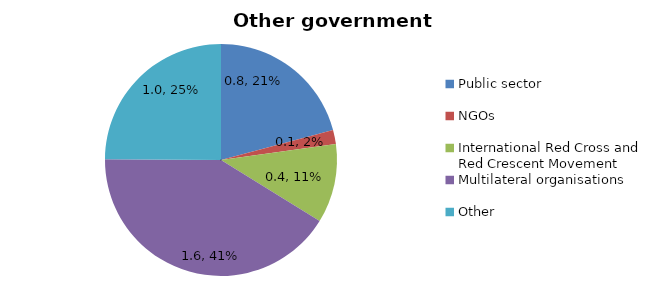
| Category | Other government donors |
|---|---|
| Public sector | 0.797 |
| NGOs | 0.076 |
| International Red Cross and Red Crescent Movement  | 0.422 |
| Multilateral organisations | 1.58 |
| Other | 0.952 |